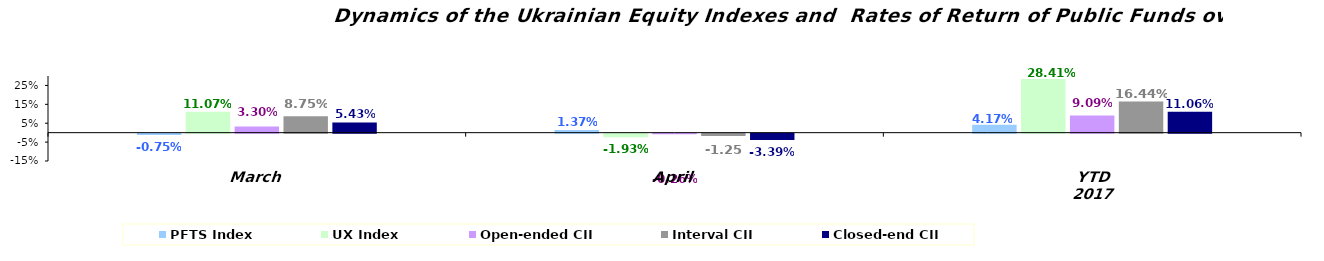
| Category | PFTS Index | UX Index | Open-ended CII | Interval CII | Closed-end CII |
|---|---|---|---|---|---|
| March | -0.008 | 0.111 | 0.033 | 0.087 | 0.054 |
| April | 0.014 | -0.019 | -0.003 | -0.013 | -0.034 |
| YTD 2017 | 0.042 | 0.284 | 0.091 | 0.164 | 0.111 |